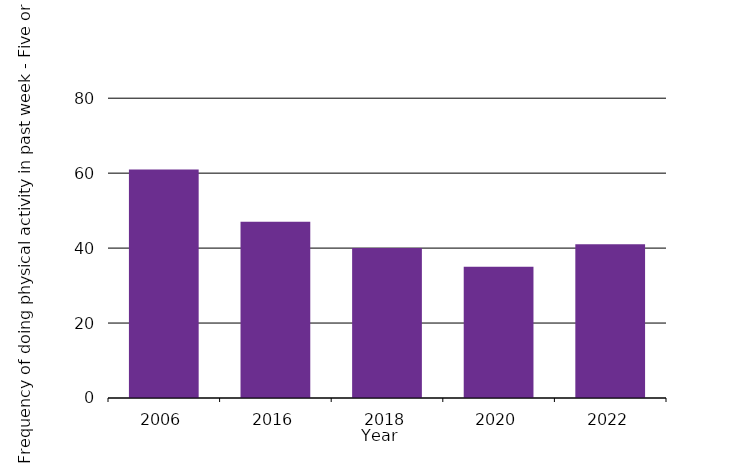
| Category | Frequency of doing physical activity in past week - Five or more days |
|---|---|
| 2006.0 | 61 |
| 2016.0 | 47 |
| 2018.0 | 40 |
| 2020.0 | 35 |
| 2022.0 | 41 |